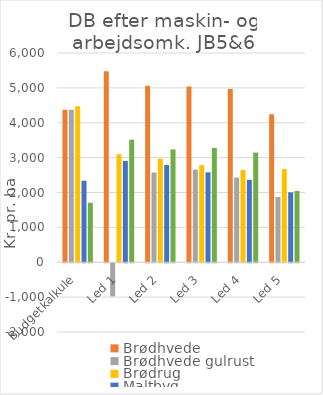
| Category | Brødhvede | Brødhvede gulrust | Brødrug | Maltbyg | Grynhavre |
|---|---|---|---|---|---|
| Budgetkalkule | 4372 | 4372 | 4474.5 | 2337 | 1707 |
| Led 1 | 5475.7 | -950.2 | 3096.7 | 2902.8 | 3514.375 |
| Led 2 | 5063.15 | 2574.3 | 2966.7 | 2787.05 | 3235.175 |
| Led 3 | 5042.05 | 2656.55 | 2784.7 | 2577.8 | 3278.125 |
| Led 4 | 4968.6 | 2429.7 | 2646.7 | 2363.3 | 3143.125 |
| Led 5 | 4246.45 | 1872 | 2672.1 | 2006.05 | 2044.275 |